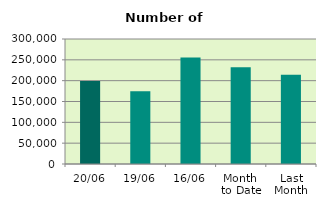
| Category | Series 0 |
|---|---|
| 20/06 | 199436 |
| 19/06 | 174856 |
| 16/06 | 255720 |
| Month 
to Date | 232181.857 |
| Last
Month | 214383.182 |